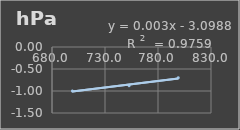
| Category | Presión Atmosférica |
|---|---|
| 699.2 | -1 |
| 752.7 | -0.88 |
| 799.1 | -0.7 |